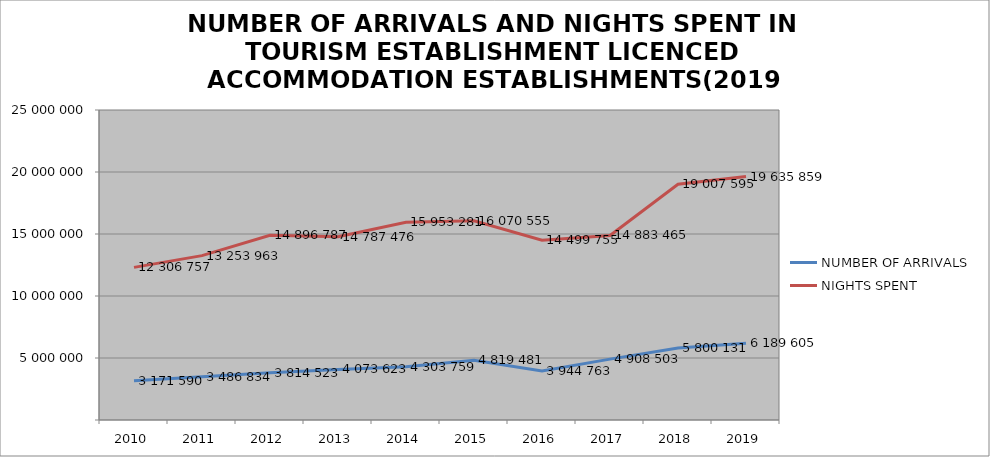
| Category | NUMBER OF ARRIVALS | NIGHTS SPENT |
|---|---|---|
| 2010 | 3171590 | 12306757 |
| 2011 | 3486834 | 13253963 |
| 2012 | 3814523 | 14896787 |
| 2013 | 4073623 | 14787476 |
| 2014 | 4303759 | 15953281 |
| 2015 | 4819481 | 16070555 |
| 2016 | 3944763 | 14499755 |
| 2017 | 4908503 | 14883465 |
| 2018 | 5800131 | 19007595 |
| 2019 | 6189605 | 19635859 |